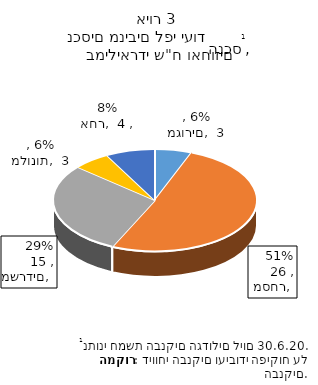
| Category | Series 0 |
|---|---|
| מגורים | 3 |
| מסחר | 26 |
| משרדים | 15 |
| מלונות | 3 |
| אחר | 4 |